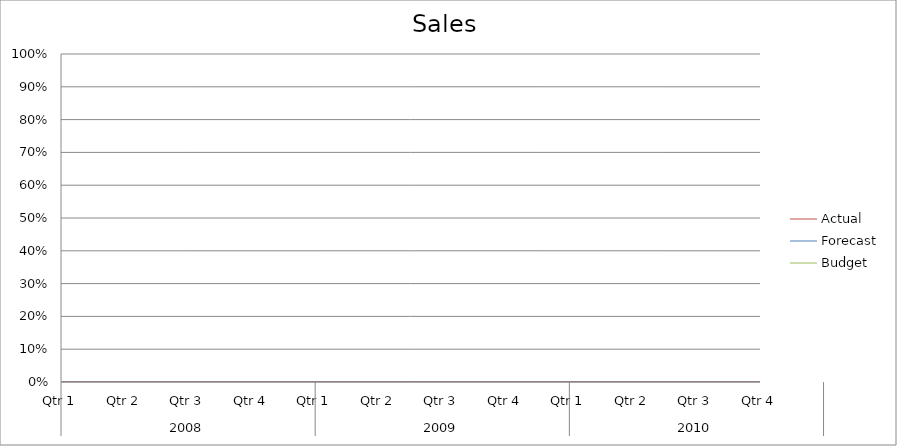
| Category | Budget | Forecast | Actual |
|---|---|---|---|
| 0 | 690 | 3140 | 2810 |
| 1 | 2120 | 2210 | 2250 |
| 2 | 2370 | 2270 | 2350 |
| 3 | 1620 | 2080 | 990 |
| 4 | 890 | 3490 | 3090 |
| 5 | 2470 | 1180 | 3300 |
| 6 | 850 | 940 | 2670 |
| 7 | 2230 | 1510 | 2280 |
| 8 | 3460 | 3290 | 3450 |
| 9 | 750 | 1740 | 1030 |
| 10 | 2040 | 530 | 3370 |
| 11 | 1050 | 910 | 2760 |